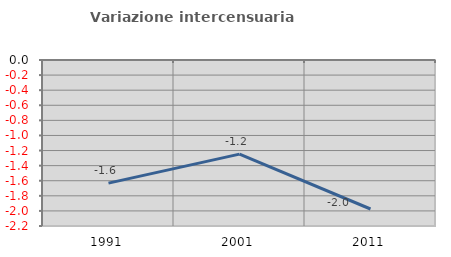
| Category | Variazione intercensuaria annua |
|---|---|
| 1991.0 | -1.631 |
| 2001.0 | -1.247 |
| 2011.0 | -1.975 |